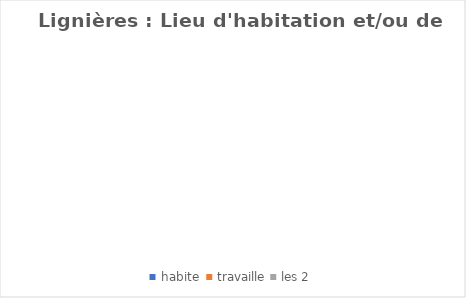
| Category | Series 0 |
|---|---|
| habite  | 0 |
| travaille | 0 |
| les 2 | 0 |